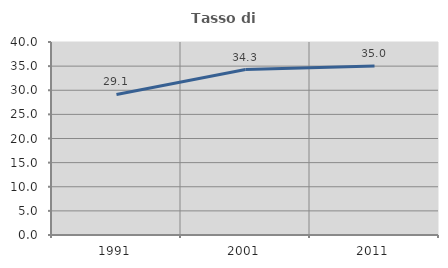
| Category | Tasso di occupazione   |
|---|---|
| 1991.0 | 29.122 |
| 2001.0 | 34.285 |
| 2011.0 | 35.039 |